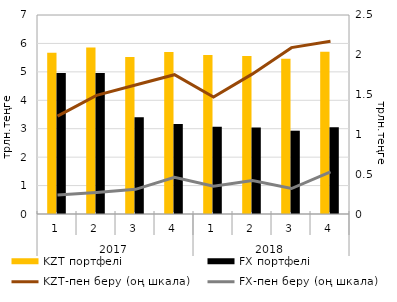
| Category | KZT портфелі | FX портфелі |
|---|---|---|
| 0 | 5.67 | 4.96 |
| 1 | 5.86 | 4.96 |
| 2 | 5.52 | 3.4 |
| 3 | 5.7 | 3.17 |
| 4 | 5.59 | 3.07 |
| 5 | 5.56 | 3.04 |
| 6 | 5.46 | 2.93 |
| 7 | 5.71 | 3.05 |